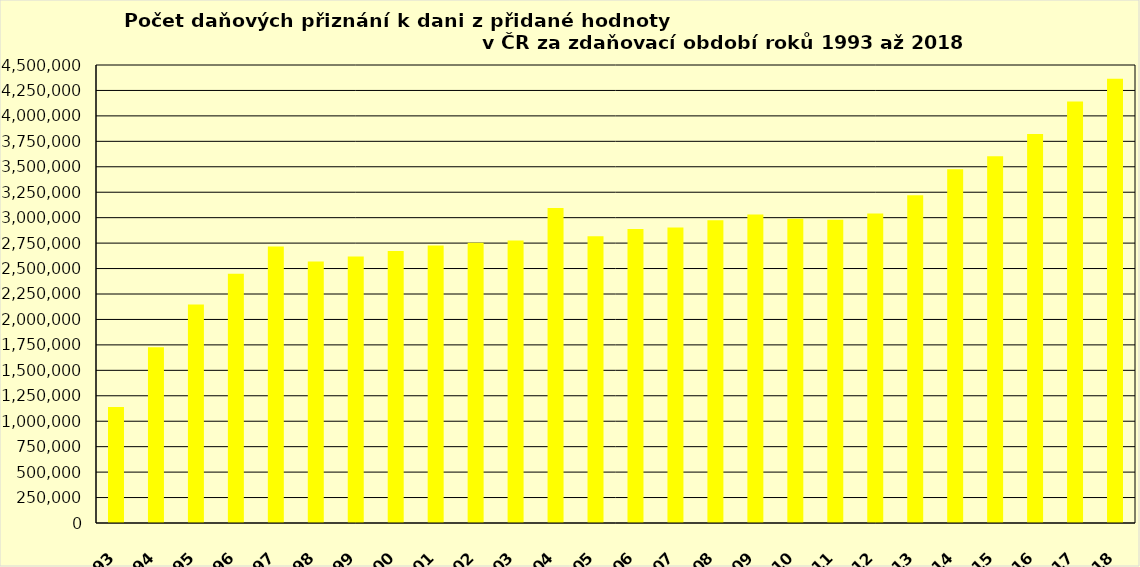
| Category | Series 0 |
|---|---|
| 1993 | 1140755 |
| 1994 | 1727290 |
| 1995 | 2147169 |
| 1996 | 2448436 |
| 1997 | 2716250 |
| 1998 | 2568304 |
| 1999 | 2617628 |
| 2000 | 2673355 |
| 2001 | 2727115 |
| 2002 | 2753616 |
| 2003 | 2776783 |
| 2004 | 3094611 |
| 2005 | 2816384 |
| 2006 | 2887845 |
| 2007 | 2902614 |
| 2008 | 2975122 |
| 2009 | 3030894 |
| 2010 | 2990251 |
| 2011 | 2980368 |
| 2012 | 3041348 |
| 2013 | 3219820 |
| 2014 | 3476453 |
| 2015 | 3602294 |
| 2016 | 3823194 |
| 2017 | 4141365 |
| 2018 | 4365349 |